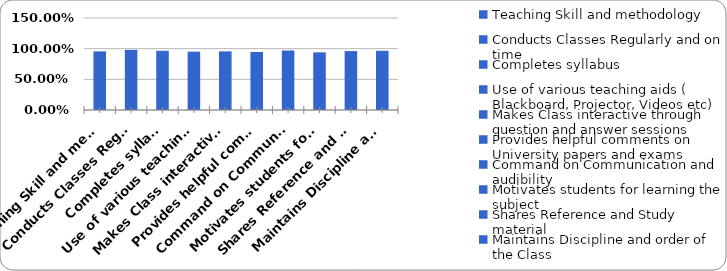
| Category | Series 0 |
|---|---|
| Teaching Skill and methodology | 0.956 |
| Conducts Classes Regularly and on time | 0.98 |
| Completes syllabus | 0.966 |
| Use of various teaching aids ( Blackboard, Projector, Videos etc) | 0.951 |
| Makes Class interactive through question and answer sessions | 0.956 |
| Provides helpful comments on University papers and exams | 0.946 |
| Command on Communication and audibility  | 0.971 |
| Motivates students for learning the subject | 0.94 |
| Shares Reference and Study material  | 0.961 |
| Maintains Discipline and order of the Class | 0.966 |